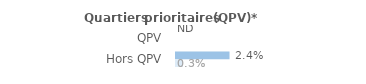
| Category | Series 1 | Series 0 |
|---|---|---|
| QPV | 0 | 0 |
| Hors QPV | 0.024 | 0.003 |